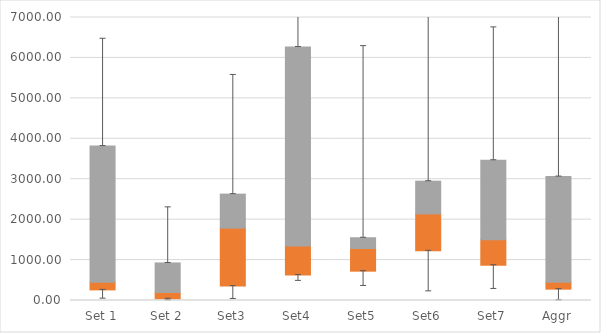
| Category | Q1 | Median-Q1 | Q3-Median |
|---|---|---|---|
| Set 1 | 262.42 | 191.104 | 3366.661 |
| Set 2 | 42.812 | 155.188 | 730.897 |
| Set3 | 356.171 | 1433.594 | 841.4 |
| Set4 | 630.895 | 719.381 | 4921.073 |
| Set5 | 725.179 | 560.709 | 266.78 |
| Set6 | 1228.077 | 914.496 | 808.744 |
| Set7 | 871.773 | 628.68 | 1969.791 |
| Aggr | 280.866 | 172.657 | 2613.06 |